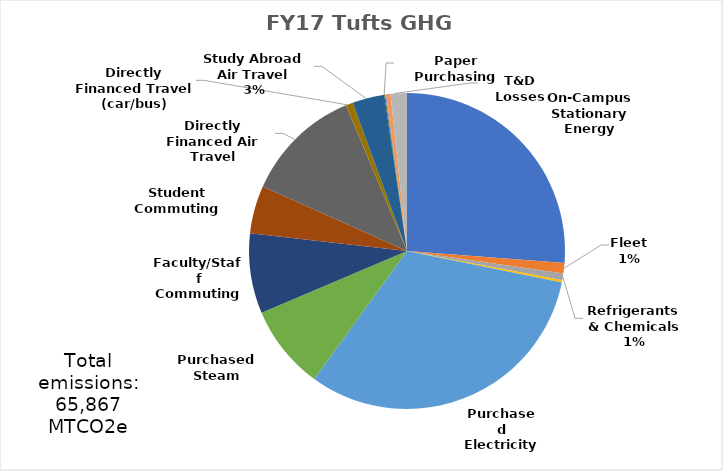
| Category | Series 0 |
|---|---|
| On-Campus Stationary Energy | 17293.97 |
| Fleet | 710.69 |
| Refrigerants & Chemicals | 449.36 |
| Fertilizer & Animals | 154.71 |
| Purchased Electricity | 20980.39 |
| Purchased Steam | 5698.52 |
| Faculty/Staff Commuting | 5397.76 |
| Student Commuting | 3233.93 |
| Directly Financed Air Travel | 7909.75 |
| Directly Financed Travel (car/bus) | 479.78 |
| Study Abroad Air Travel | 2167.4 |
| Solid Waste | -64.36 |
| Wastewater | 61.96 |
| Paper Purchasing | 295.94 |
| T&D Losses | 1097.26 |